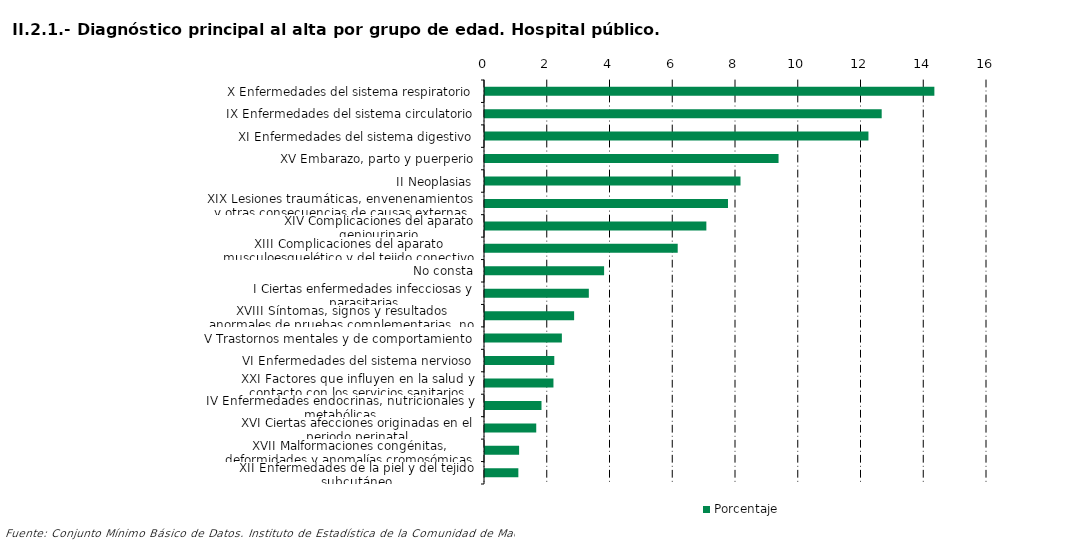
| Category | Porcentaje |
|---|---|
| X Enfermedades del sistema respiratorio | 14.323 |
| IX Enfermedades del sistema circulatorio | 12.644 |
| XI Enfermedades del sistema digestivo | 12.221 |
| XV Embarazo, parto y puerperio | 9.356 |
| II Neoplasias | 8.144 |
| XIX Lesiones traumáticas, envenenamientos y otras consecuencias de causas externas | 7.745 |
| XIV Complicaciones del aparato geniourinario | 7.055 |
| XIII Complicaciones del aparato musculoesquelético y del tejido conectivo | 6.142 |
| No consta | 3.796 |
| I Ciertas enfermedades infecciosas y parasitarias | 3.309 |
| XVIII Síntomas, signos y resultados anormales de pruebas complementarias, no clasificados bajo otro concepto | 2.84 |
| V Trastornos mentales y de comportamiento | 2.45 |
| VI Enfermedades del sistema nervioso | 2.208 |
| XXI Factores que influyen en la salud y contacto con los servicios sanitarios | 2.182 |
| IV Enfermedades endocrinas, nutricionales y metabólicas | 1.801 |
| XVI Ciertas afecciones originadas en el periodo perinatal | 1.633 |
| XVII Malformaciones congénitas, deformidades y anomalías cromosómicas | 1.087 |
| XII Enfermedades de la piel y del tejido subcutáneo | 1.063 |